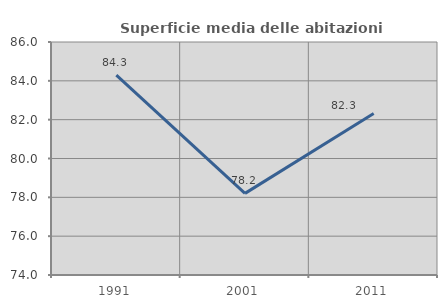
| Category | Superficie media delle abitazioni occupate |
|---|---|
| 1991.0 | 84.292 |
| 2001.0 | 78.203 |
| 2011.0 | 82.315 |